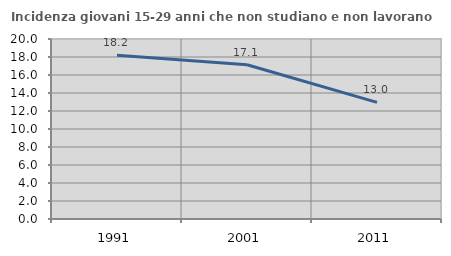
| Category | Incidenza giovani 15-29 anni che non studiano e non lavorano  |
|---|---|
| 1991.0 | 18.182 |
| 2001.0 | 17.143 |
| 2011.0 | 12.963 |